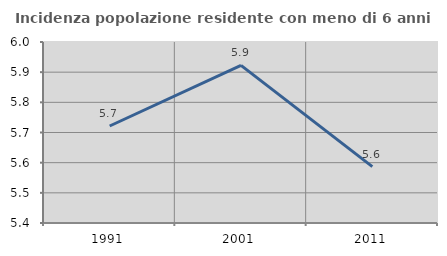
| Category | Incidenza popolazione residente con meno di 6 anni |
|---|---|
| 1991.0 | 5.722 |
| 2001.0 | 5.922 |
| 2011.0 | 5.587 |